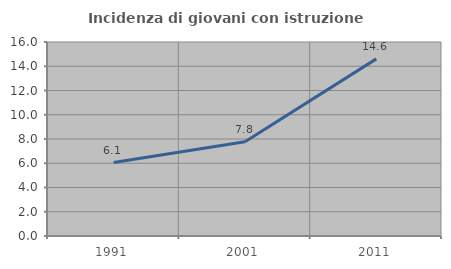
| Category | Incidenza di giovani con istruzione universitaria |
|---|---|
| 1991.0 | 6.061 |
| 2001.0 | 7.778 |
| 2011.0 | 14.607 |